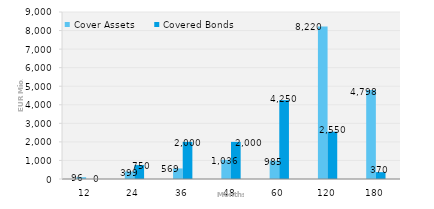
| Category | Cover Assets | Covered Bonds |
|---|---|---|
| 12.0 | 96.334 | 0 |
| 24.0 | 399.184 | 750 |
| 36.0 | 569.368 | 2000 |
| 48.0 | 1035.925 | 2000 |
| 60.0 | 985.425 | 4250 |
| 120.0 | 8219.727 | 2550 |
| 180.0 | 4798.388 | 370 |